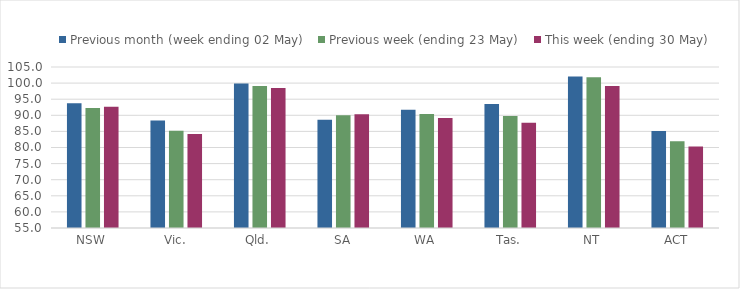
| Category | Previous month (week ending 02 May) | Previous week (ending 23 May) | This week (ending 30 May) |
|---|---|---|---|
| NSW | 93.734 | 92.258 | 92.641 |
| Vic. | 88.416 | 85.213 | 84.175 |
| Qld. | 99.899 | 99.07 | 98.469 |
| SA | 88.629 | 90.025 | 90.324 |
| WA | 91.696 | 90.406 | 89.136 |
| Tas. | 93.487 | 89.8 | 87.66 |
| NT | 102.073 | 101.813 | 99.093 |
| ACT | 85.106 | 81.915 | 80.298 |